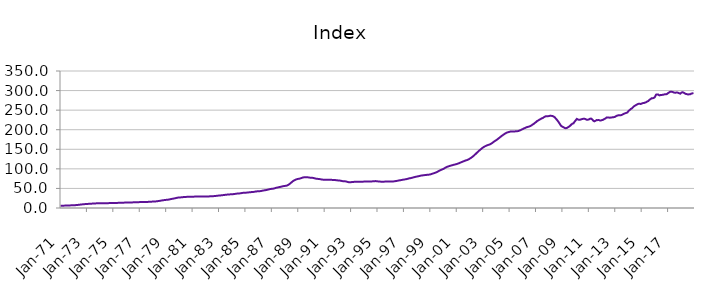
| Category | Index |
|---|---|
| 1971-01-01 | 5.879 |
| 1971-02-01 | 5.921 |
| 1971-03-01 | 5.963 |
| 1971-04-01 | 6.018 |
| 1971-05-01 | 6.108 |
| 1971-06-01 | 6.203 |
| 1971-07-01 | 6.32 |
| 1971-08-01 | 6.446 |
| 1971-09-01 | 6.572 |
| 1971-10-01 | 6.703 |
| 1971-11-01 | 6.844 |
| 1971-12-01 | 7.015 |
| 1972-01-01 | 7.135 |
| 1972-02-01 | 7.213 |
| 1972-03-01 | 7.39 |
| 1972-04-01 | 7.638 |
| 1972-05-01 | 7.997 |
| 1972-06-01 | 8.312 |
| 1972-07-01 | 8.674 |
| 1972-08-01 | 9.023 |
| 1972-09-01 | 9.332 |
| 1972-10-01 | 9.62 |
| 1972-11-01 | 9.887 |
| 1972-12-01 | 10.162 |
| 1973-01-01 | 10.359 |
| 1973-02-01 | 10.498 |
| 1973-03-01 | 10.658 |
| 1973-04-01 | 10.841 |
| 1973-05-01 | 11.075 |
| 1973-06-01 | 11.227 |
| 1973-07-01 | 11.386 |
| 1973-08-01 | 11.562 |
| 1973-09-01 | 11.768 |
| 1973-10-01 | 11.982 |
| 1973-11-01 | 12.145 |
| 1973-12-01 | 12.262 |
| 1974-01-01 | 12.324 |
| 1974-02-01 | 12.392 |
| 1974-03-01 | 12.389 |
| 1974-04-01 | 12.362 |
| 1974-05-01 | 12.339 |
| 1974-06-01 | 12.34 |
| 1974-07-01 | 12.352 |
| 1974-08-01 | 12.392 |
| 1974-09-01 | 12.465 |
| 1974-10-01 | 12.555 |
| 1974-11-01 | 12.63 |
| 1974-12-01 | 12.703 |
| 1975-01-01 | 12.737 |
| 1975-02-01 | 12.78 |
| 1975-03-01 | 12.857 |
| 1975-04-01 | 12.965 |
| 1975-05-01 | 13.097 |
| 1975-06-01 | 13.168 |
| 1975-07-01 | 13.237 |
| 1975-08-01 | 13.332 |
| 1975-09-01 | 13.462 |
| 1975-10-01 | 13.606 |
| 1975-11-01 | 13.732 |
| 1975-12-01 | 13.867 |
| 1976-01-01 | 13.963 |
| 1976-02-01 | 14.052 |
| 1976-03-01 | 14.114 |
| 1976-04-01 | 14.179 |
| 1976-05-01 | 14.264 |
| 1976-06-01 | 14.32 |
| 1976-07-01 | 14.382 |
| 1976-08-01 | 14.474 |
| 1976-09-01 | 14.605 |
| 1976-10-01 | 14.752 |
| 1976-11-01 | 14.87 |
| 1976-12-01 | 14.976 |
| 1977-01-01 | 15.034 |
| 1977-02-01 | 15.102 |
| 1977-03-01 | 15.145 |
| 1977-04-01 | 15.197 |
| 1977-05-01 | 15.276 |
| 1977-06-01 | 15.347 |
| 1977-07-01 | 15.436 |
| 1977-08-01 | 15.557 |
| 1977-09-01 | 15.705 |
| 1977-10-01 | 15.871 |
| 1977-11-01 | 16.048 |
| 1977-12-01 | 16.278 |
| 1978-01-01 | 16.449 |
| 1978-02-01 | 16.582 |
| 1978-03-01 | 16.762 |
| 1978-04-01 | 17.003 |
| 1978-05-01 | 17.391 |
| 1978-06-01 | 17.783 |
| 1978-07-01 | 18.258 |
| 1978-08-01 | 18.744 |
| 1978-09-01 | 19.213 |
| 1978-10-01 | 19.678 |
| 1978-11-01 | 20.113 |
| 1978-12-01 | 20.542 |
| 1979-01-01 | 20.797 |
| 1979-02-01 | 20.968 |
| 1979-03-01 | 21.394 |
| 1979-04-01 | 21.979 |
| 1979-05-01 | 22.725 |
| 1979-06-01 | 23.198 |
| 1979-07-01 | 23.69 |
| 1979-08-01 | 24.243 |
| 1979-09-01 | 24.906 |
| 1979-10-01 | 25.613 |
| 1979-11-01 | 26.202 |
| 1979-12-01 | 26.66 |
| 1980-01-01 | 26.911 |
| 1980-02-01 | 27.107 |
| 1980-03-01 | 27.357 |
| 1980-04-01 | 27.651 |
| 1980-05-01 | 27.994 |
| 1980-06-01 | 28.178 |
| 1980-07-01 | 28.344 |
| 1980-08-01 | 28.498 |
| 1980-09-01 | 28.607 |
| 1980-10-01 | 28.676 |
| 1980-11-01 | 28.73 |
| 1980-12-01 | 28.843 |
| 1981-01-01 | 28.911 |
| 1981-02-01 | 29.013 |
| 1981-03-01 | 29.116 |
| 1981-04-01 | 29.254 |
| 1981-05-01 | 29.394 |
| 1981-06-01 | 29.441 |
| 1981-07-01 | 29.464 |
| 1981-08-01 | 29.469 |
| 1981-09-01 | 29.414 |
| 1981-10-01 | 29.312 |
| 1981-11-01 | 29.219 |
| 1981-12-01 | 29.209 |
| 1982-01-01 | 29.164 |
| 1982-02-01 | 29.184 |
| 1982-03-01 | 29.346 |
| 1982-04-01 | 29.618 |
| 1982-05-01 | 29.924 |
| 1982-06-01 | 30.035 |
| 1982-07-01 | 30.119 |
| 1982-08-01 | 30.28 |
| 1982-09-01 | 30.54 |
| 1982-10-01 | 30.849 |
| 1982-11-01 | 31.157 |
| 1982-12-01 | 31.538 |
| 1983-01-01 | 31.828 |
| 1983-02-01 | 32.078 |
| 1983-03-01 | 32.337 |
| 1983-04-01 | 32.659 |
| 1983-05-01 | 33.081 |
| 1983-06-01 | 33.413 |
| 1983-07-01 | 33.773 |
| 1983-08-01 | 34.116 |
| 1983-09-01 | 34.39 |
| 1983-10-01 | 34.614 |
| 1983-11-01 | 34.826 |
| 1983-12-01 | 35.104 |
| 1984-01-01 | 35.27 |
| 1984-02-01 | 35.438 |
| 1984-03-01 | 35.758 |
| 1984-04-01 | 36.202 |
| 1984-05-01 | 36.71 |
| 1984-06-01 | 36.936 |
| 1984-07-01 | 37.124 |
| 1984-08-01 | 37.411 |
| 1984-09-01 | 37.87 |
| 1984-10-01 | 38.4 |
| 1984-11-01 | 38.81 |
| 1984-12-01 | 39.095 |
| 1985-01-01 | 39.174 |
| 1985-02-01 | 39.283 |
| 1985-03-01 | 39.552 |
| 1985-04-01 | 39.93 |
| 1985-05-01 | 40.361 |
| 1985-06-01 | 40.527 |
| 1985-07-01 | 40.681 |
| 1985-08-01 | 40.948 |
| 1985-09-01 | 41.393 |
| 1985-10-01 | 41.902 |
| 1985-11-01 | 42.329 |
| 1985-12-01 | 42.671 |
| 1986-01-01 | 42.803 |
| 1986-02-01 | 42.939 |
| 1986-03-01 | 43.335 |
| 1986-04-01 | 43.908 |
| 1986-05-01 | 44.624 |
| 1986-06-01 | 45.057 |
| 1986-07-01 | 45.499 |
| 1986-08-01 | 46.028 |
| 1986-09-01 | 46.692 |
| 1986-10-01 | 47.409 |
| 1986-11-01 | 48.06 |
| 1986-12-01 | 48.667 |
| 1987-01-01 | 49.02 |
| 1987-02-01 | 49.311 |
| 1987-03-01 | 49.944 |
| 1987-04-01 | 50.795 |
| 1987-05-01 | 51.813 |
| 1987-06-01 | 52.387 |
| 1987-07-01 | 52.937 |
| 1987-08-01 | 53.541 |
| 1987-09-01 | 54.197 |
| 1987-10-01 | 54.877 |
| 1987-11-01 | 55.513 |
| 1987-12-01 | 56.172 |
| 1988-01-01 | 56.486 |
| 1988-02-01 | 56.756 |
| 1988-03-01 | 57.701 |
| 1988-04-01 | 59.124 |
| 1988-05-01 | 61.264 |
| 1988-06-01 | 63.424 |
| 1988-07-01 | 65.968 |
| 1988-08-01 | 68.307 |
| 1988-09-01 | 70.109 |
| 1988-10-01 | 71.604 |
| 1988-11-01 | 72.807 |
| 1988-12-01 | 73.875 |
| 1989-01-01 | 74.434 |
| 1989-02-01 | 74.906 |
| 1989-03-01 | 75.707 |
| 1989-04-01 | 76.727 |
| 1989-05-01 | 77.807 |
| 1989-06-01 | 78.279 |
| 1989-07-01 | 78.601 |
| 1989-08-01 | 78.752 |
| 1989-09-01 | 78.622 |
| 1989-10-01 | 78.258 |
| 1989-11-01 | 77.774 |
| 1989-12-01 | 77.38 |
| 1990-01-01 | 77.025 |
| 1990-02-01 | 77.011 |
| 1990-03-01 | 76.482 |
| 1990-04-01 | 75.796 |
| 1990-05-01 | 74.994 |
| 1990-06-01 | 74.611 |
| 1990-07-01 | 74.285 |
| 1990-08-01 | 73.967 |
| 1990-09-01 | 73.52 |
| 1990-10-01 | 73.009 |
| 1990-11-01 | 72.535 |
| 1990-12-01 | 72.334 |
| 1991-01-01 | 72.192 |
| 1991-02-01 | 72.268 |
| 1991-03-01 | 72.153 |
| 1991-04-01 | 72.077 |
| 1991-05-01 | 71.977 |
| 1991-06-01 | 71.933 |
| 1991-07-01 | 71.885 |
| 1991-08-01 | 71.819 |
| 1991-09-01 | 71.705 |
| 1991-10-01 | 71.501 |
| 1991-11-01 | 71.166 |
| 1991-12-01 | 70.813 |
| 1992-01-01 | 70.463 |
| 1992-02-01 | 70.409 |
| 1992-03-01 | 69.918 |
| 1992-04-01 | 69.325 |
| 1992-05-01 | 68.671 |
| 1992-06-01 | 68.457 |
| 1992-07-01 | 68.303 |
| 1992-08-01 | 67.98 |
| 1992-09-01 | 67.29 |
| 1992-10-01 | 66.434 |
| 1992-11-01 | 65.854 |
| 1992-12-01 | 65.871 |
| 1993-01-01 | 66.034 |
| 1993-02-01 | 66.322 |
| 1993-03-01 | 66.581 |
| 1993-04-01 | 66.905 |
| 1993-05-01 | 67.182 |
| 1993-06-01 | 67.213 |
| 1993-07-01 | 67.233 |
| 1993-08-01 | 67.289 |
| 1993-09-01 | 67.247 |
| 1993-10-01 | 67.126 |
| 1993-11-01 | 67.046 |
| 1993-12-01 | 67.281 |
| 1994-01-01 | 67.604 |
| 1994-02-01 | 68.006 |
| 1994-03-01 | 67.991 |
| 1994-04-01 | 67.827 |
| 1994-05-01 | 67.683 |
| 1994-06-01 | 67.696 |
| 1994-07-01 | 67.777 |
| 1994-08-01 | 67.944 |
| 1994-09-01 | 68.21 |
| 1994-10-01 | 68.532 |
| 1994-11-01 | 68.685 |
| 1994-12-01 | 68.595 |
| 1995-01-01 | 68.092 |
| 1995-02-01 | 67.66 |
| 1995-03-01 | 67.497 |
| 1995-04-01 | 67.327 |
| 1995-05-01 | 67.356 |
| 1995-06-01 | 67.213 |
| 1995-07-01 | 67.36 |
| 1995-08-01 | 67.425 |
| 1995-09-01 | 67.463 |
| 1995-10-01 | 67.439 |
| 1995-11-01 | 67.524 |
| 1995-12-01 | 67.607 |
| 1996-01-01 | 67.632 |
| 1996-02-01 | 67.59 |
| 1996-03-01 | 67.814 |
| 1996-04-01 | 68.077 |
| 1996-05-01 | 68.578 |
| 1996-06-01 | 68.945 |
| 1996-07-01 | 69.543 |
| 1996-08-01 | 70.122 |
| 1996-09-01 | 70.708 |
| 1996-10-01 | 71.134 |
| 1996-11-01 | 71.585 |
| 1996-12-01 | 72.224 |
| 1997-01-01 | 72.682 |
| 1997-02-01 | 73.17 |
| 1997-03-01 | 73.587 |
| 1997-04-01 | 74.264 |
| 1997-05-01 | 75.148 |
| 1997-06-01 | 75.819 |
| 1997-07-01 | 76.292 |
| 1997-08-01 | 77.048 |
| 1997-09-01 | 77.723 |
| 1997-10-01 | 78.598 |
| 1997-11-01 | 79.21 |
| 1997-12-01 | 79.988 |
| 1998-01-01 | 80.449 |
| 1998-02-01 | 81.141 |
| 1998-03-01 | 81.745 |
| 1998-04-01 | 82.495 |
| 1998-05-01 | 83.027 |
| 1998-06-01 | 83.355 |
| 1998-07-01 | 83.747 |
| 1998-08-01 | 84.113 |
| 1998-09-01 | 84.484 |
| 1998-10-01 | 84.731 |
| 1998-11-01 | 85.018 |
| 1998-12-01 | 85.363 |
| 1999-01-01 | 85.875 |
| 1999-02-01 | 86.896 |
| 1999-03-01 | 87.796 |
| 1999-04-01 | 88.688 |
| 1999-05-01 | 89.666 |
| 1999-06-01 | 90.701 |
| 1999-07-01 | 91.918 |
| 1999-08-01 | 93.495 |
| 1999-09-01 | 95.101 |
| 1999-10-01 | 96.577 |
| 1999-11-01 | 97.58 |
| 1999-12-01 | 98.926 |
| 2000-01-01 | 100 |
| 2000-02-01 | 101.936 |
| 2000-03-01 | 103.455 |
| 2000-04-01 | 105.075 |
| 2000-05-01 | 105.895 |
| 2000-06-01 | 106.901 |
| 2000-07-01 | 107.798 |
| 2000-08-01 | 108.633 |
| 2000-09-01 | 109.409 |
| 2000-10-01 | 110.207 |
| 2000-11-01 | 110.863 |
| 2000-12-01 | 111.699 |
| 2001-01-01 | 112.376 |
| 2001-02-01 | 113.427 |
| 2001-03-01 | 114.41 |
| 2001-04-01 | 115.617 |
| 2001-05-01 | 116.92 |
| 2001-06-01 | 118 |
| 2001-07-01 | 119.178 |
| 2001-08-01 | 120.352 |
| 2001-09-01 | 121.415 |
| 2001-10-01 | 122.129 |
| 2001-11-01 | 123.346 |
| 2001-12-01 | 124.695 |
| 2002-01-01 | 126.498 |
| 2002-02-01 | 128.249 |
| 2002-03-01 | 130.341 |
| 2002-04-01 | 132.594 |
| 2002-05-01 | 135.137 |
| 2002-06-01 | 137.714 |
| 2002-07-01 | 140.534 |
| 2002-08-01 | 143.04 |
| 2002-09-01 | 145.7 |
| 2002-10-01 | 148.191 |
| 2002-11-01 | 150.379 |
| 2002-12-01 | 152.788 |
| 2003-01-01 | 154.938 |
| 2003-02-01 | 156.702 |
| 2003-03-01 | 158.127 |
| 2003-04-01 | 159.492 |
| 2003-05-01 | 160.649 |
| 2003-06-01 | 161.58 |
| 2003-07-01 | 162.401 |
| 2003-08-01 | 164.014 |
| 2003-09-01 | 165.699 |
| 2003-10-01 | 167.901 |
| 2003-11-01 | 170.039 |
| 2003-12-01 | 171.829 |
| 2004-01-01 | 173.609 |
| 2004-02-01 | 175.589 |
| 2004-03-01 | 177.991 |
| 2004-04-01 | 180.138 |
| 2004-05-01 | 182.465 |
| 2004-06-01 | 184.54 |
| 2004-07-01 | 186.551 |
| 2004-08-01 | 188.625 |
| 2004-09-01 | 190.257 |
| 2004-10-01 | 192.019 |
| 2004-11-01 | 192.962 |
| 2004-12-01 | 193.904 |
| 2005-01-01 | 194.627 |
| 2005-02-01 | 195.72 |
| 2005-03-01 | 195.655 |
| 2005-04-01 | 195.754 |
| 2005-05-01 | 195.194 |
| 2005-06-01 | 195.793 |
| 2005-07-01 | 195.867 |
| 2005-08-01 | 196.175 |
| 2005-09-01 | 196.736 |
| 2005-10-01 | 197.938 |
| 2005-11-01 | 198.884 |
| 2005-12-01 | 200.645 |
| 2006-01-01 | 201.661 |
| 2006-02-01 | 203.374 |
| 2006-03-01 | 204.511 |
| 2006-04-01 | 205.861 |
| 2006-05-01 | 206.826 |
| 2006-06-01 | 207.511 |
| 2006-07-01 | 208.388 |
| 2006-08-01 | 209.567 |
| 2006-09-01 | 211.353 |
| 2006-10-01 | 213.443 |
| 2006-11-01 | 215.14 |
| 2006-12-01 | 217.475 |
| 2007-01-01 | 219.496 |
| 2007-02-01 | 222.231 |
| 2007-03-01 | 223.7 |
| 2007-04-01 | 225.58 |
| 2007-05-01 | 226.869 |
| 2007-06-01 | 228.812 |
| 2007-07-01 | 229.701 |
| 2007-08-01 | 231.63 |
| 2007-09-01 | 233.384 |
| 2007-10-01 | 234.664 |
| 2007-11-01 | 234.312 |
| 2007-12-01 | 234.555 |
| 2008-01-01 | 235.086 |
| 2008-02-01 | 236.026 |
| 2008-03-01 | 235.364 |
| 2008-04-01 | 234.965 |
| 2008-05-01 | 233.6 |
| 2008-06-01 | 231.702 |
| 2008-07-01 | 228.29 |
| 2008-08-01 | 225.152 |
| 2008-09-01 | 221.485 |
| 2008-10-01 | 217.485 |
| 2008-11-01 | 212.758 |
| 2008-12-01 | 209.323 |
| 2009-01-01 | 207.652 |
| 2009-02-01 | 206.212 |
| 2009-03-01 | 204.576 |
| 2009-04-01 | 203.86 |
| 2009-05-01 | 204.572 |
| 2009-06-01 | 206.247 |
| 2009-07-01 | 207.906 |
| 2009-08-01 | 210.209 |
| 2009-09-01 | 213.072 |
| 2009-10-01 | 215.548 |
| 2009-11-01 | 216.169 |
| 2009-12-01 | 220.435 |
| 2010-01-01 | 223.882 |
| 2010-02-01 | 227.544 |
| 2010-03-01 | 226.207 |
| 2010-04-01 | 225.371 |
| 2010-05-01 | 225.616 |
| 2010-06-01 | 226.496 |
| 2010-07-01 | 227.242 |
| 2010-08-01 | 228.031 |
| 2010-09-01 | 227.934 |
| 2010-10-01 | 227.086 |
| 2010-11-01 | 225.565 |
| 2010-12-01 | 225.597 |
| 2011-01-01 | 226.214 |
| 2011-02-01 | 228.039 |
| 2011-03-01 | 228.503 |
| 2011-04-01 | 226.162 |
| 2011-05-01 | 223.102 |
| 2011-06-01 | 221.419 |
| 2011-07-01 | 222.781 |
| 2011-08-01 | 224.513 |
| 2011-09-01 | 224.472 |
| 2011-10-01 | 224.841 |
| 2011-11-01 | 223.579 |
| 2011-12-01 | 223.822 |
| 2012-01-01 | 224.584 |
| 2012-02-01 | 225.473 |
| 2012-03-01 | 227.466 |
| 2012-04-01 | 228.575 |
| 2012-05-01 | 231.11 |
| 2012-06-01 | 231.251 |
| 2012-07-01 | 231.282 |
| 2012-08-01 | 230.612 |
| 2012-09-01 | 231.126 |
| 2012-10-01 | 231.503 |
| 2012-11-01 | 231.747 |
| 2012-12-01 | 232.346 |
| 2013-01-01 | 233.26 |
| 2013-02-01 | 235.199 |
| 2013-03-01 | 236.287 |
| 2013-04-01 | 236.897 |
| 2013-05-01 | 236.822 |
| 2013-06-01 | 237.016 |
| 2013-07-01 | 237.888 |
| 2013-08-01 | 239.493 |
| 2013-09-01 | 240.786 |
| 2013-10-01 | 242.115 |
| 2013-11-01 | 242.898 |
| 2013-12-01 | 244.057 |
| 2014-01-01 | 247.816 |
| 2014-02-01 | 250.169 |
| 2014-03-01 | 252.769 |
| 2014-04-01 | 254.326 |
| 2014-05-01 | 257.246 |
| 2014-06-01 | 260.069 |
| 2014-07-01 | 261.53 |
| 2014-08-01 | 263.472 |
| 2014-09-01 | 264.905 |
| 2014-10-01 | 266.07 |
| 2014-11-01 | 266.347 |
| 2014-12-01 | 265.659 |
| 2015-01-01 | 266.928 |
| 2015-02-01 | 267.88 |
| 2015-03-01 | 268.307 |
| 2015-04-01 | 269.155 |
| 2015-05-01 | 270.34 |
| 2015-06-01 | 272.163 |
| 2015-07-01 | 273.277 |
| 2015-08-01 | 276.288 |
| 2015-09-01 | 278.116 |
| 2015-10-01 | 280.486 |
| 2015-11-01 | 280.294 |
| 2015-12-01 | 281.199 |
| 2016-01-01 | 283.607 |
| 2016-02-01 | 289.619 |
| 2016-03-01 | 290.057 |
| 2016-04-01 | 289.886 |
| 2016-05-01 | 287.681 |
| 2016-06-01 | 288.483 |
| 2016-07-01 | 288.661 |
| 2016-08-01 | 289.259 |
| 2016-09-01 | 289.711 |
| 2016-10-01 | 290.701 |
| 2016-11-01 | 290.463 |
| 2016-12-01 | 291.375 |
| 2017-01-01 | 293.717 |
| 2017-02-01 | 295.456 |
| 2017-03-01 | 297.078 |
| 2017-04-01 | 296.912 |
| 2017-05-01 | 296.553 |
| 2017-06-01 | 295.078 |
| 2017-07-01 | 294.677 |
| 2017-08-01 | 294.669 |
| 2017-09-01 | 295.305 |
| 2017-10-01 | 294.345 |
| 2017-11-01 | 293.162 |
| 2017-12-01 | 292.069 |
| 2018-01-01 | 294.438 |
| 2018-02-01 | 295.808 |
| 2018-03-01 | 294.946 |
| 2018-04-01 | 292.936 |
| 2018-05-01 | 291.507 |
| 2018-06-01 | 290.937 |
| 2018-07-01 | 290.037 |
| 2018-08-01 | 290.429 |
| 2018-09-01 | 290.453 |
| 2018-10-01 | 292.102 |
| 2018-11-01 | 292.847 |
| 2018-12-01 | 293.688 |